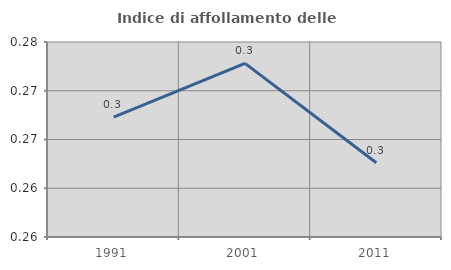
| Category | Indice di affollamento delle abitazioni  |
|---|---|
| 1991.0 | 0.267 |
| 2001.0 | 0.273 |
| 2011.0 | 0.263 |